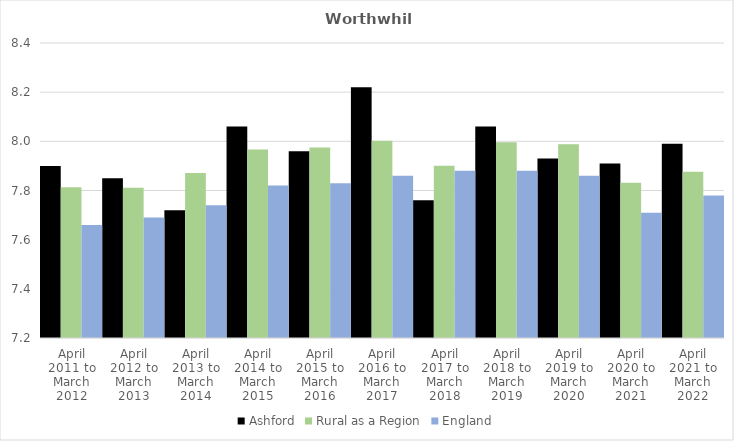
| Category | Ashford | Rural as a Region | England |
|---|---|---|---|
| April 2011 to March 2012 | 7.9 | 7.813 | 7.66 |
| April 2012 to March 2013 | 7.85 | 7.811 | 7.69 |
| April 2013 to March 2014 | 7.72 | 7.871 | 7.74 |
| April 2014 to March 2015 | 8.06 | 7.967 | 7.82 |
| April 2015 to March 2016 | 7.96 | 7.975 | 7.83 |
| April 2016 to March 2017 | 8.22 | 8.002 | 7.86 |
| April 2017 to March 2018 | 7.76 | 7.9 | 7.88 |
| April 2018 to March 2019 | 8.06 | 7.996 | 7.88 |
| April 2019 to March 2020 | 7.93 | 7.988 | 7.86 |
| April 2020 to March 2021 | 7.91 | 7.831 | 7.71 |
| April 2021 to March 2022 | 7.99 | 7.877 | 7.78 |